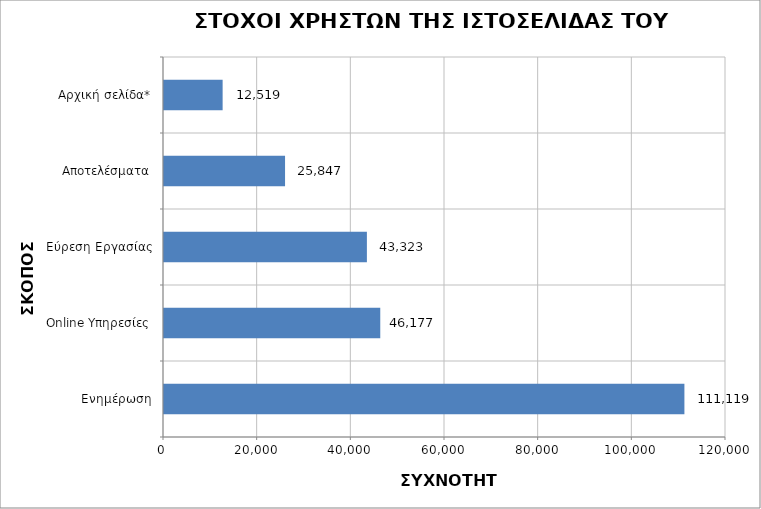
| Category | Series 0 |
|---|---|
| Ενημέρωση | 111119 |
| Online Υπηρεσίες | 46177 |
| Εύρεση Εργασίας | 43323 |
| Αποτελέσματα | 25847 |
| Αρχική σελίδα* | 12519 |